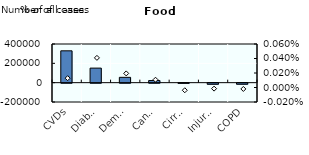
| Category | Number of cases |
|---|---|
| CVDs | 329445.691 |
| Diabetes | 150445.851 |
| Dementia | 55176.61 |
| Cancers | 22077.941 |
| Cirrhosis | -1639.353 |
| Injuries | -11347.546 |
| COPD | -10902.002 |